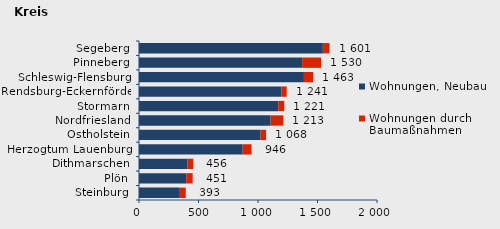
| Category | Wohnungen, Neubau | Wohnungen durch Baumaßnahmen | Series 2 |
|---|---|---|---|
| Steinburg | 336 | 57 | 393 |
| Plön | 397 | 54 | 451 |
| Dithmarschen | 406 | 50 | 456 |
| Herzogtum Lauenburg | 871 | 75 | 946 |
| Ostholstein | 1021 | 47 | 1068 |
| Nordfriesland | 1106 | 107 | 1213 |
| Stormarn | 1170 | 51 | 1221 |
| Rendsburg-Eckernförde | 1197 | 44 | 1241 |
| Schleswig-Flensburg | 1386 | 77 | 1463 |
| Pinneberg | 1371 | 159 | 1530 |
| Segeberg | 1545 | 56 | 1601 |